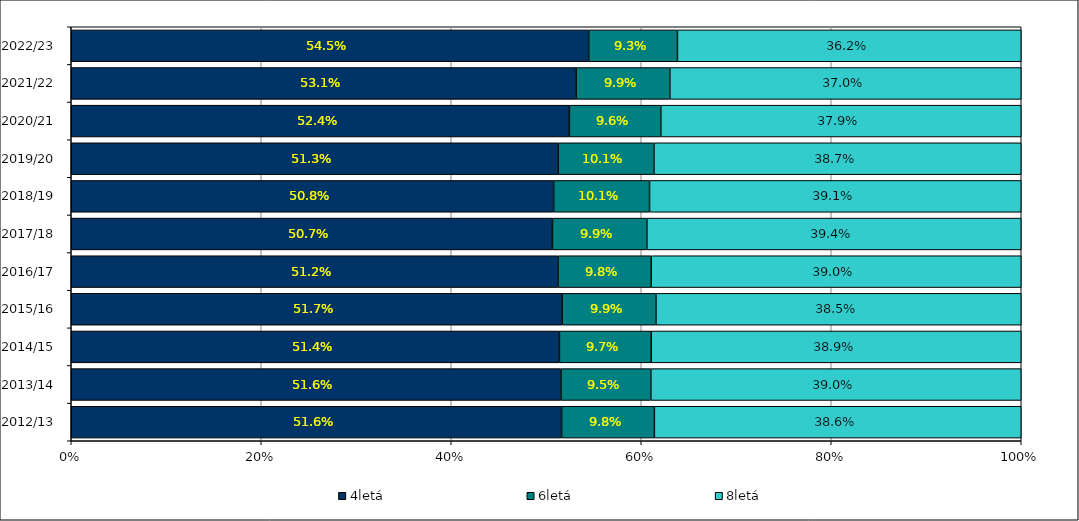
| Category | 4letá | 6letá | 8letá |
|---|---|---|---|
| 2012/13 | 0.516 | 0.098 | 0.386 |
| 2013/14 | 0.516 | 0.095 | 0.39 |
| 2014/15 | 0.514 | 0.097 | 0.389 |
| 2015/16 | 0.517 | 0.099 | 0.385 |
| 2016/17 | 0.512 | 0.098 | 0.39 |
| 2017/18 | 0.507 | 0.099 | 0.394 |
| 2018/19 | 0.508 | 0.101 | 0.391 |
| 2019/20 | 0.513 | 0.101 | 0.387 |
| 2020/21 | 0.524 | 0.096 | 0.379 |
| 2021/22 | 0.531 | 0.099 | 0.37 |
| 2022/23 | 0.545 | 0.093 | 0.362 |